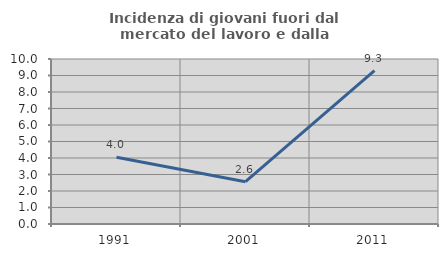
| Category | Incidenza di giovani fuori dal mercato del lavoro e dalla formazione  |
|---|---|
| 1991.0 | 4.04 |
| 2001.0 | 2.564 |
| 2011.0 | 9.302 |